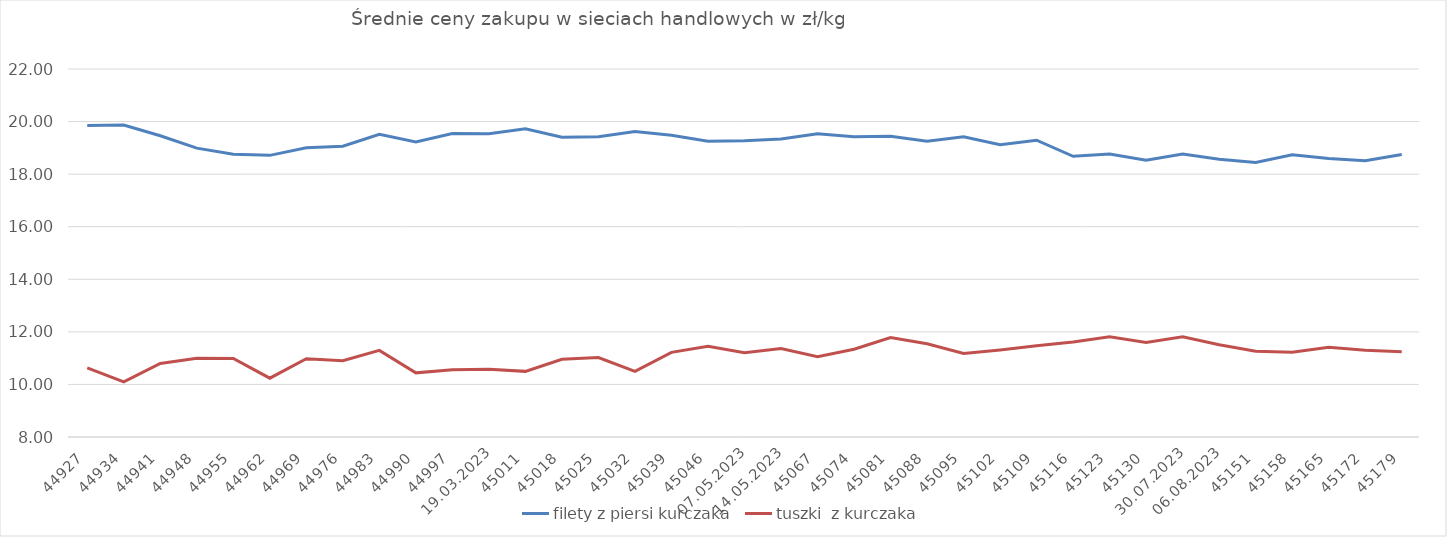
| Category | filety z piersi kurczaka | tuszki  z kurczaka |
|---|---|---|
| 01.01.2023 | 19.85 | 10.63 |
| 08.01.2023 | 19.87 | 10.1 |
| 15.01.2023 | 19.46 | 10.8 |
| 22.01.2023 | 18.99 | 11 |
| 29.01.2023 | 18.76 | 10.991 |
| 05.02.2023 | 18.715 | 10.238 |
| 12.02.2023 | 19 | 10.98 |
| 19.02.2023 | 19.06 | 10.9 |
| 26.02.2023 | 19.519 | 11.295 |
| 05.03.2023 | 19.22 | 10.44 |
| 12.03.2023 | 19.547 | 10.56 |
| 19.03.2023 | 19.54 | 10.58 |
| 26.03.2023 | 19.728 | 10.497 |
| 02.04.2023 | 19.408 | 10.956 |
| 09.04.2023 | 19.42 | 11.025 |
| 16.04.2023 | 19.624 | 10.494 |
| 23.04.2023 | 19.48 | 11.22 |
| 30.04.2023 | 19.25 | 11.45 |
| 07.05.2023 | 19.27 | 11.21 |
| 14.05.2023 | 19.34 | 11.37 |
| 21.05.2023 | 19.54 | 11.05 |
| 28.05.2023 | 19.42 | 11.339 |
| 04.06.2023 | 19.44 | 11.78 |
| 11.06.2023 | 19.25 | 11.55 |
| 18.06.2023 | 19.42 | 11.18 |
| 25.06.2023 | 19.12 | 11.31 |
| 02.07.2023 | 19.29 | 11.47 |
| 09.07.2023 | 18.68 | 11.61 |
| 16.07.2023 | 18.769 | 11.815 |
| 23.07.2023 | 18.528 | 11.6 |
| 30.07.2023 | 18.77 | 11.81 |
| 06.08.2023 | 18.57 | 11.51 |
| 13.08.2023 | 18.44 | 11.26 |
| 20.08.2023 | 18.74 | 11.22 |
| 27.08.2023 | 18.596 | 11.416 |
| 03.09.2023 | 18.51 | 11.3 |
| 10.09.2023 | 18.747 | 11.245 |